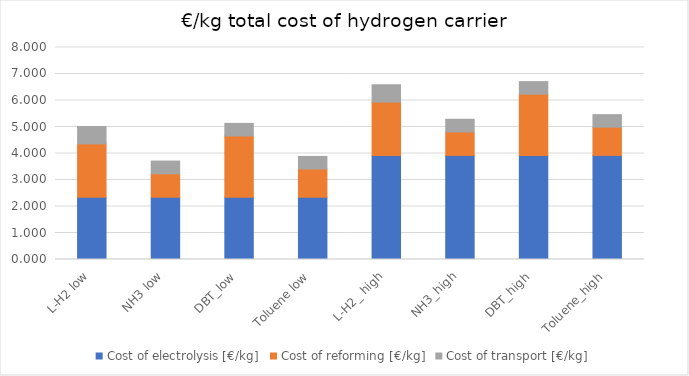
| Category | Cost of electrolysis [€/kg] | Cost of reforming [€/kg] | Cost of transport [€/kg] |
|---|---|---|---|
| L-H2 low | 2.349 | 2.014 | 0.654 |
| NH3 low | 2.349 | 0.886 | 0.48 |
| DBT_low | 2.349 | 2.313 | 0.474 |
| Toluene low | 2.349 | 1.066 | 0.474 |
| L-H2_ high | 3.927 | 2.014 | 0.654 |
| NH3_high | 3.927 | 0.886 | 0.48 |
| DBT_high | 3.927 | 2.313 | 0.474 |
| Toluene_high | 3.927 | 1.066 | 0.474 |